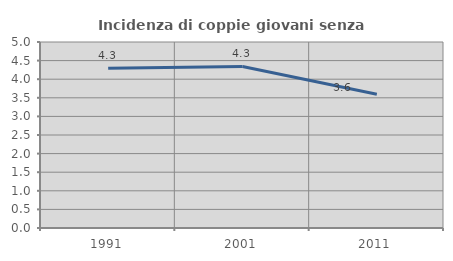
| Category | Incidenza di coppie giovani senza figli |
|---|---|
| 1991.0 | 4.297 |
| 2001.0 | 4.342 |
| 2011.0 | 3.597 |